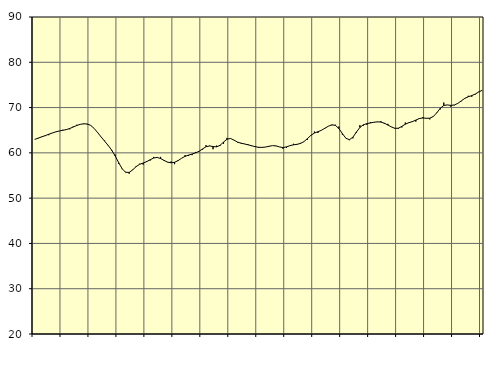
| Category | Piggar | Samtliga anställda (inkl. anställda utomlands) |
|---|---|---|
| nan | 63 | 62.98 |
| 87.0 | 63.2 | 63.26 |
| 87.0 | 63.6 | 63.53 |
| 87.0 | 63.7 | 63.81 |
| nan | 63.9 | 64.1 |
| 88.0 | 64.4 | 64.38 |
| 88.0 | 64.6 | 64.63 |
| 88.0 | 64.8 | 64.82 |
| nan | 65.1 | 64.98 |
| 89.0 | 65.2 | 65.13 |
| 89.0 | 65.2 | 65.38 |
| 89.0 | 65.8 | 65.7 |
| nan | 66.2 | 66.04 |
| 90.0 | 66.3 | 66.29 |
| 90.0 | 66.5 | 66.41 |
| 90.0 | 66.3 | 66.38 |
| nan | 66.1 | 66.06 |
| 91.0 | 65.4 | 65.39 |
| 91.0 | 64.4 | 64.46 |
| 91.0 | 63.5 | 63.5 |
| nan | 62.7 | 62.58 |
| 92.0 | 61.7 | 61.64 |
| 92.0 | 60.5 | 60.61 |
| 92.0 | 59.6 | 59.32 |
| nan | 57.6 | 57.84 |
| 93.0 | 56.4 | 56.49 |
| 93.0 | 55.8 | 55.71 |
| 93.0 | 55.4 | 55.68 |
| nan | 56.3 | 56.23 |
| 94.0 | 57.1 | 56.96 |
| 94.0 | 57.6 | 57.48 |
| 94.0 | 57.4 | 57.75 |
| nan | 58.2 | 58.06 |
| 95.0 | 58.3 | 58.47 |
| 95.0 | 59.1 | 58.86 |
| 95.0 | 59 | 58.99 |
| nan | 59.1 | 58.75 |
| 96.0 | 58.2 | 58.32 |
| 96.0 | 57.9 | 57.95 |
| 96.0 | 58.1 | 57.8 |
| nan | 57.5 | 57.92 |
| 97.0 | 58.4 | 58.29 |
| 97.0 | 58.8 | 58.81 |
| 97.0 | 59.5 | 59.23 |
| nan | 59.3 | 59.5 |
| 98.0 | 59.5 | 59.74 |
| 98.0 | 60.2 | 60 |
| 98.0 | 60.3 | 60.34 |
| nan | 60.7 | 60.86 |
| 99.0 | 61.7 | 61.36 |
| 99.0 | 61.6 | 61.52 |
| 99.0 | 60.8 | 61.4 |
| nan | 61.6 | 61.32 |
| 0.0 | 61.5 | 61.66 |
| 0.0 | 62 | 62.37 |
| 0.0 | 63.3 | 63.02 |
| nan | 63.2 | 63.18 |
| 1.0 | 62.8 | 62.81 |
| 1.0 | 62.3 | 62.38 |
| 1.0 | 62.2 | 62.13 |
| nan | 62 | 61.96 |
| 2.0 | 61.9 | 61.78 |
| 2.0 | 61.5 | 61.58 |
| 2.0 | 61.5 | 61.37 |
| nan | 61.1 | 61.23 |
| 3.0 | 61.2 | 61.21 |
| 3.0 | 61.3 | 61.28 |
| 3.0 | 61.5 | 61.45 |
| nan | 61.6 | 61.6 |
| 4.0 | 61.5 | 61.54 |
| 4.0 | 61.3 | 61.31 |
| 4.0 | 60.9 | 61.17 |
| nan | 61.1 | 61.32 |
| 5.0 | 61.6 | 61.59 |
| 5.0 | 62 | 61.77 |
| 5.0 | 61.8 | 61.88 |
| nan | 62.2 | 62.08 |
| 6.0 | 62.5 | 62.48 |
| 6.0 | 62.9 | 63.15 |
| 6.0 | 63.8 | 63.87 |
| nan | 64.7 | 64.38 |
| 7.0 | 64.4 | 64.67 |
| 7.0 | 65 | 64.98 |
| 7.0 | 65.5 | 65.44 |
| nan | 65.9 | 65.89 |
| 8.0 | 66.1 | 66.19 |
| 8.0 | 66.2 | 66.07 |
| 8.0 | 65.8 | 65.36 |
| nan | 64 | 64.25 |
| 9.0 | 63.2 | 63.22 |
| 9.0 | 62.8 | 62.91 |
| 9.0 | 63.2 | 63.46 |
| nan | 64.4 | 64.59 |
| 10.0 | 66.1 | 65.61 |
| 10.0 | 66 | 66.2 |
| 10.0 | 66.2 | 66.45 |
| nan | 66.8 | 66.6 |
| 11.0 | 66.8 | 66.76 |
| 11.0 | 66.8 | 66.85 |
| 11.0 | 67 | 66.8 |
| nan | 66.4 | 66.55 |
| 12.0 | 66.4 | 66.14 |
| 12.0 | 65.7 | 65.73 |
| 12.0 | 65.5 | 65.42 |
| nan | 65.3 | 65.44 |
| 13.0 | 65.6 | 65.85 |
| 13.0 | 66.7 | 66.33 |
| 13.0 | 66.6 | 66.66 |
| nan | 67 | 66.89 |
| 14.0 | 66.9 | 67.23 |
| 14.0 | 67.5 | 67.58 |
| 14.0 | 67.9 | 67.7 |
| nan | 67.7 | 67.64 |
| 15.0 | 67.4 | 67.65 |
| 15.0 | 68.1 | 68.03 |
| 15.0 | 68.9 | 68.84 |
| nan | 69.6 | 69.85 |
| 16.0 | 71.1 | 70.47 |
| 16.0 | 70.6 | 70.58 |
| 16.0 | 70.2 | 70.49 |
| nan | 70.5 | 70.57 |
| 17.0 | 70.9 | 70.92 |
| 17.0 | 71.4 | 71.47 |
| 17.0 | 72.1 | 72.03 |
| nan | 72.6 | 72.39 |
| 18.0 | 72.4 | 72.64 |
| 18.0 | 72.9 | 72.99 |
| 18.0 | 73.5 | 73.44 |
| nan | 73.8 | 73.82 |